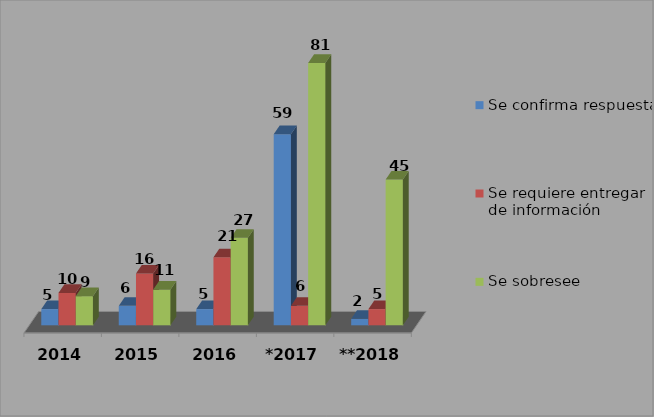
| Category | Se confirma respuesta | Se requiere entregar de información  | Se sobresee  |
|---|---|---|---|
| 2014 | 5 | 10 | 9 |
| 2015 | 6 | 16 | 11 |
| 2016 | 5 | 21 | 27 |
| *2017 | 59 | 6 | 81 |
| **2018 | 2 | 5 | 45 |